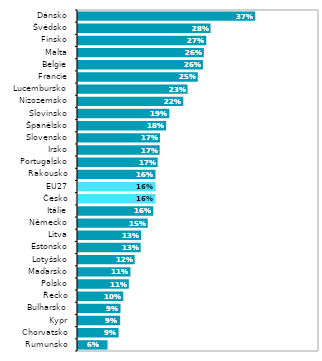
| Category | Series 0 |
|---|---|
| Rumunsko | 0.063 |
| Chorvatsko | 0.086 |
| Kypr | 0.09 |
| Bulharsko | 0.09 |
| Řecko | 0.096 |
| Polsko | 0.108 |
| Maďarsko | 0.111 |
| Lotyšsko | 0.12 |
| Estonsko | 0.132 |
| Litva | 0.133 |
| Německo | 0.147 |
| Itálie | 0.158 |
| Česko | 0.163 |
| EU27 | 0.163 |
| Rakousko | 0.163 |
| Portugalsko | 0.167 |
| Irsko | 0.172 |
| Slovensko | 0.172 |
| Španělsko | 0.185 |
| Slovinsko | 0.192 |
| Nizozemsko | 0.22 |
| Lucembursko | 0.229 |
| Francie | 0.251 |
| Belgie | 0.261 |
| Malta | 0.263 |
| Finsko | 0.268 |
| Švédsko | 0.277 |
| Dánsko | 0.369 |